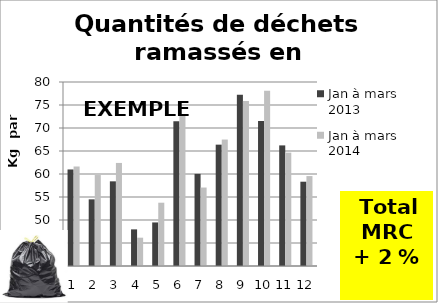
| Category | Jan à mars 
2013 | Jan à mars 
2014 |
|---|---|---|
| 0 | 60.985 | 61.631 |
| 1 | 54.489 | 59.775 |
| 2 | 58.406 | 62.403 |
| 3 | 47.963 | 46.155 |
| 4 | 49.47 | 53.76 |
| 5 | 71.45 | 72.621 |
| 6 | 60.028 | 57.058 |
| 7 | 66.38 | 67.489 |
| 8 | 77.225 | 75.867 |
| 9 | 71.52 | 78.121 |
| 10 | 66.219 | 64.644 |
| 11 | 58.325 | 59.552 |